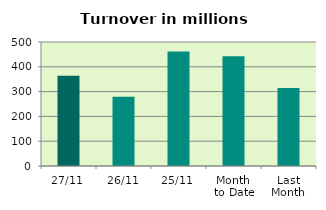
| Category | Series 0 |
|---|---|
| 27/11 | 363.472 |
| 26/11 | 279.599 |
| 25/11 | 461.714 |
| Month 
to Date | 442.234 |
| Last
Month | 314.143 |